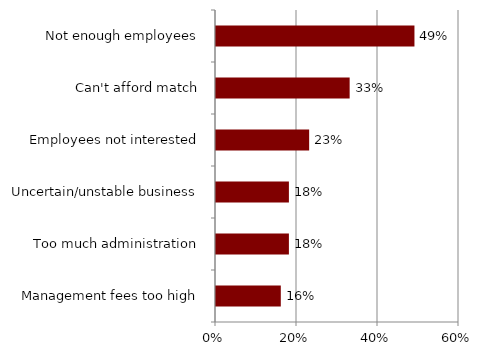
| Category | Series 0 |
|---|---|
| Management fees too high | 0.16 |
| Too much administration | 0.18 |
| Uncertain/unstable business | 0.18 |
| Employees not interested | 0.23 |
| Can't afford match | 0.33 |
| Not enough employees | 0.49 |